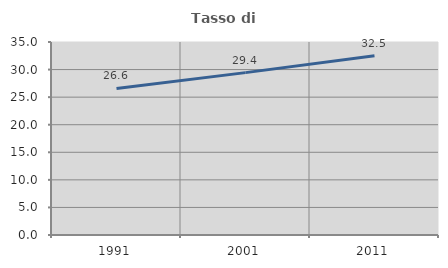
| Category | Tasso di occupazione   |
|---|---|
| 1991.0 | 26.576 |
| 2001.0 | 29.445 |
| 2011.0 | 32.498 |